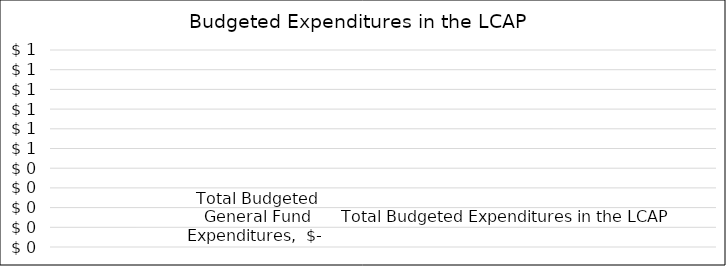
| Category | Total Budgeted General Fund Expenditures | Total Budgeted Expenditures in the LCAP |
|---|---|---|
| 0 | 0 | 0 |